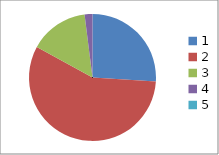
| Category | Series 0 |
|---|---|
| 0 | 0.26 |
| 1 | 0.57 |
| 2 | 0.15 |
| 3 | 0.02 |
| 4 | 0 |